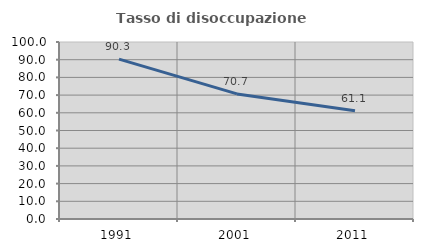
| Category | Tasso di disoccupazione giovanile  |
|---|---|
| 1991.0 | 90.328 |
| 2001.0 | 70.667 |
| 2011.0 | 61.111 |